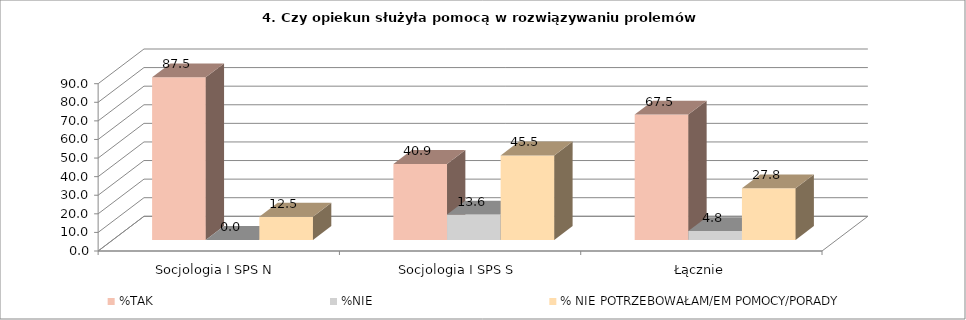
| Category | %TAK | %NIE | % NIE POTRZEBOWAŁAM/EM POMOCY/PORADY |
|---|---|---|---|
| Socjologia I SPS N  | 87.5 | 0 | 12.5 |
| Socjologia I SPS S | 40.909 | 13.636 | 45.455 |
| Łącznie | 67.464 | 4.785 | 27.751 |